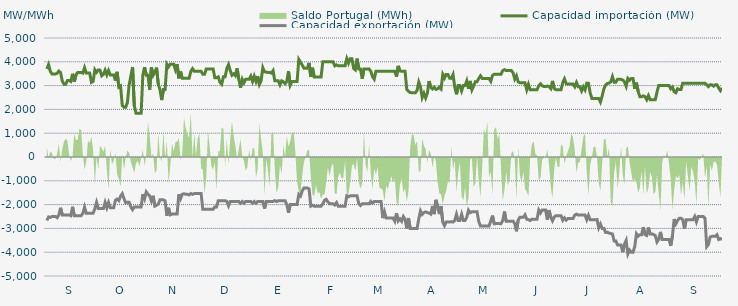
| Category | Capacidad importación (MW) | Capacidad exportación (MW) |
|---|---|---|
| 0 | 3700 | -2666.667 |
| 1900-01-01 | 3883.333 | -2516.667 |
| 1900-01-02 | 3600 | -2537.5 |
| 1900-01-03 | 3487.5 | -2500 |
| 1900-01-04 | 3487.5 | -2500 |
| 1900-01-05 | 3487.5 | -2500 |
| 1900-01-06 | 3518.75 | -2550 |
| 1900-01-07 | 3612.5 | -2433.333 |
| 1900-01-08 | 3543.75 | -2133.333 |
| 1900-01-09 | 3193.75 | -2433.333 |
| 1900-01-10 | 3060.417 | -2433.333 |
| 1900-01-11 | 3059.167 | -2433.333 |
| 1900-01-12 | 3212.5 | -2433.333 |
| 1900-01-13 | 3212.5 | -2433.333 |
| 1900-01-14 | 3175 | -2466.667 |
| 1900-01-15 | 3495.833 | -2091.667 |
| 1900-01-16 | 3166.667 | -2466.667 |
| 1900-01-17 | 3454.167 | -2466.667 |
| 1900-01-18 | 3550 | -2466.667 |
| 1900-01-19 | 3550 | -2466.667 |
| 1900-01-20 | 3550 | -2466.667 |
| 1900-01-21 | 3525 | -2366.667 |
| 1900-01-22 | 3754.167 | -2104.167 |
| 1900-01-23 | 3525 | -2366.667 |
| 1900-01-24 | 3525 | -2366.667 |
| 1900-01-25 | 3525 | -2366.667 |
| 1900-01-26 | 3135 | -2366.667 |
| 1900-01-27 | 3175 | -2366.667 |
| 1900-01-28 | 3666.667 | -2166.667 |
| 1900-01-29 | 3558.333 | -1904.167 |
| 1900-01-30 | 3658.333 | -2166.667 |
| 1900-01-31 | 3650 | -2166.667 |
| 1900-02-01 | 3412.5 | -2166.667 |
| 1900-02-02 | 3475 | -2166.667 |
| 1900-02-03 | 3650 | -1904.167 |
| 1900-02-04 | 3450 | -2133.333 |
| 1900-02-05 | 3633.333 | -1912.5 |
| 1900-02-06 | 3450 | -2133.333 |
| 1900-02-07 | 3450 | -2133.333 |
| 1900-02-08 | 3450 | -2133.333 |
| 1900-02-09 | 3210.417 | -1816.667 |
| 1900-02-10 | 3577.083 | -1766.667 |
| 1900-02-11 | 2937.5 | -1833.333 |
| 1900-02-12 | 2985.417 | -1645.833 |
| 1900-02-13 | 2162.5 | -1541.667 |
| 1900-02-14 | 2087.5 | -1745.833 |
| 1900-02-15 | 2087.5 | -1929.167 |
| 1900-02-16 | 2295.833 | -1900 |
| 1900-02-17 | 3025 | -1900 |
| 1900-02-18 | 3395.833 | -2100 |
| 1900-02-19 | 3781.25 | -2212.5 |
| 1900-02-20 | 2170.833 | -2100 |
| 1900-02-21 | 1837.5 | -2100 |
| 1900-02-22 | 1837.5 | -2100 |
| 1900-02-23 | 1837.5 | -2100 |
| 1900-02-24 | 1837.5 | -2100 |
| 1900-02-25 | 3433.333 | -1566.667 |
| 1900-02-26 | 3776 | -1760 |
| 1900-02-27 | 3433.333 | -1466.667 |
| 1900-02-28 | 3433.333 | -1566.667 |
| 1900-02-28 | 2829.167 | -1633.333 |
| 1900-03-01 | 3766.667 | -1854.167 |
| 1900-03-02 | 3433.333 | -1629.167 |
| 1900-03-03 | 3562.5 | -2066.667 |
| 1900-03-04 | 3754.167 | -2029.167 |
| 1900-03-05 | 3064.583 | -1979.167 |
| 1900-03-06 | 2833.333 | -1800 |
| 1900-03-07 | 2391.667 | -1800 |
| 1900-03-08 | 2833.333 | -1800 |
| 1900-03-09 | 2833.333 | -1841.667 |
| 1900-03-10 | 3900 | -2466.667 |
| 1900-03-11 | 3787.5 | -2133.333 |
| 1900-03-12 | 3900 | -2429.167 |
| 1900-03-13 | 3900 | -2400 |
| 1900-03-14 | 3900 | -2400 |
| 1900-03-15 | 3668.75 | -2400 |
| 1900-03-16 | 3900 | -2400 |
| 1900-03-17 | 3304.167 | -1566.667 |
| 1900-03-18 | 3595.833 | -1754.167 |
| 1900-03-19 | 3304.167 | -1566.667 |
| 1900-03-20 | 3304.167 | -1541.667 |
| 1900-03-21 | 3304.167 | -1566.667 |
| 1900-03-22 | 3304.167 | -1566.667 |
| 1900-03-23 | 3304.167 | -1591.667 |
| 1900-03-24 | 3600 | -1533.333 |
| 1900-03-25 | 3712.5 | -1570.833 |
| 1900-03-26 | 3600 | -1533.333 |
| 1900-03-27 | 3600 | -1533.333 |
| 1900-03-28 | 3600 | -1533.333 |
| 1900-03-29 | 3600 | -1533.333 |
| 1900-03-30 | 3600 | -1533.333 |
| 1900-03-31 | 3475 | -2200 |
| 1900-04-01 | 3475 | -2200 |
| 1900-04-02 | 3700 | -2200 |
| 1900-04-03 | 3700 | -2200 |
| 1900-04-04 | 3700 | -2200 |
| 1900-04-05 | 3700 | -2200 |
| 1900-04-06 | 3700 | -2200 |
| 1900-04-07 | 3329.167 | -2095.833 |
| 1900-04-08 | 3329.167 | -2095.833 |
| 1900-04-09 | 3366.667 | -1833.333 |
| 1900-04-10 | 3141.667 | -1833.333 |
| 1900-04-11 | 3058.333 | -1833.333 |
| 1900-04-12 | 3366.667 | -1833.333 |
| 1900-04-13 | 3366.667 | -1833.333 |
| 1900-04-14 | 3725 | -1866.667 |
| 1900-04-15 | 3883.333 | -2054.167 |
| 1900-04-16 | 3631.25 | -1866.667 |
| 1900-04-17 | 3435.417 | -1866.667 |
| 1900-04-18 | 3495.833 | -1866.667 |
| 1900-04-19 | 3416.667 | -1866.667 |
| 1900-04-20 | 3725 | -1866.667 |
| 1900-04-21 | 3266.667 | -1866.667 |
| 1900-04-22 | 2912.5 | -1941.667 |
| 1900-04-23 | 3266.667 | -1866.667 |
| 1900-04-24 | 3116.667 | -1941.667 |
| 1900-04-25 | 3266.667 | -1866.667 |
| 1900-04-26 | 3266.667 | -1866.667 |
| 1900-04-27 | 3266.667 | -1866.667 |
| 1900-04-28 | 3400 | -1866.667 |
| 1900-04-29 | 3175 | -1941.667 |
| 1900-04-30 | 3400 | -1866.667 |
| 1900-05-01 | 3175 | -1941.667 |
| 1900-05-02 | 3400 | -1866.667 |
| 1900-05-03 | 3047.917 | -1866.667 |
| 1900-05-04 | 3200 | -1866.667 |
| 1900-05-05 | 3754.167 | -1866.667 |
| 1900-05-06 | 3581.25 | -2166.667 |
| 1900-05-07 | 3566.667 | -1866.667 |
| 1900-05-08 | 3554.167 | -1866.667 |
| 1900-05-09 | 3554.167 | -1866.667 |
| 1900-05-10 | 3525 | -1866.667 |
| 1900-05-11 | 3629.167 | -1866.667 |
| 1900-05-12 | 3200 | -1833.333 |
| 1900-05-13 | 3200 | -1870.833 |
| 1900-05-14 | 3200 | -1833.333 |
| 1900-05-15 | 3031.25 | -1833.333 |
| 1900-05-16 | 3200 | -1833.333 |
| 1900-05-17 | 3162.5 | -1833.333 |
| 1900-05-18 | 3083.333 | -1833.333 |
| 1900-05-19 | 3175 | -2000 |
| 1900-05-20 | 3608.333 | -2337.5 |
| 1900-05-21 | 3016.667 | -2000 |
| 1900-05-22 | 3175 | -2000 |
| 1900-05-23 | 3175 | -2000 |
| 1900-05-24 | 3175 | -2000 |
| 1900-05-25 | 3175 | -2000 |
| 1900-05-26 | 4100 | -1566.667 |
| 1900-05-27 | 3987.5 | -1641.667 |
| 1900-05-28 | 3864.583 | -1425 |
| 1900-05-29 | 3733.333 | -1300 |
| 1900-05-30 | 3733.333 | -1300 |
| 1900-05-31 | 3733.333 | -1300 |
| 1900-06-01 | 3952.083 | -1341.667 |
| 1900-06-02 | 3362.5 | -2066.667 |
| 1900-06-03 | 3752.083 | -2029.167 |
| 1900-06-04 | 3362.5 | -2066.667 |
| 1900-06-05 | 3362.5 | -2066.667 |
| 1900-06-06 | 3362.5 | -2066.667 |
| 1900-06-07 | 3362.5 | -2066.667 |
| 1900-06-08 | 3362.5 | -2066.667 |
| 1900-06-09 | 4000 | -1966.667 |
| 1900-06-10 | 4000 | -1816.667 |
| 1900-06-11 | 4000 | -1779.167 |
| 1900-06-12 | 4000 | -1891.667 |
| 1900-06-13 | 4000 | -1966.667 |
| 1900-06-14 | 4000 | -1966.667 |
| 1900-06-15 | 4000 | -1966.667 |
| 1900-06-16 | 3829.167 | -2016.667 |
| 1900-06-17 | 3870.833 | -1916.667 |
| 1900-06-18 | 3829.167 | -2066.667 |
| 1900-06-19 | 3829.167 | -2066.667 |
| 1900-06-20 | 3829.167 | -2066.667 |
| 1900-06-21 | 3829.167 | -2066.667 |
| 1900-06-22 | 3829.167 | -2066.667 |
| 1900-06-23 | 4133.333 | -1633.333 |
| 1900-06-24 | 3945.833 | -1670.833 |
| 1900-06-25 | 4133.333 | -1633.333 |
| 1900-06-26 | 4133.333 | -1633.333 |
| 1900-06-27 | 3716.667 | -1633.333 |
| 1900-06-28 | 3658.333 | -1633.333 |
| 1900-06-29 | 4133.333 | -1633.333 |
| 1900-06-30 | 3700 | -1966.667 |
| 1900-07-01 | 3700 | -2041.667 |
| 1900-07-02 | 3283.333 | -1966.667 |
| 1900-07-03 | 3700 | -1966.667 |
| 1900-07-04 | 3700 | -1966.667 |
| 1900-07-05 | 3700 | -1966.667 |
| 1900-07-06 | 3700 | -1966.667 |
| 1900-07-07 | 3600 | -1866.667 |
| 1900-07-08 | 3375 | -1941.667 |
| 1900-07-09 | 3270.833 | -1866.667 |
| 1900-07-10 | 3600 | -1866.667 |
| 1900-07-11 | 3600 | -1866.667 |
| 1900-07-12 | 3600 | -1866.667 |
| 1900-07-13 | 3600 | -1866.667 |
| 1900-07-14 | 3600 | -2566.667 |
| 1900-07-15 | 3600 | -2304.167 |
| 1900-07-16 | 3600 | -2566.667 |
| 1900-07-17 | 3600 | -2566.667 |
| 1900-07-18 | 3600 | -2566.667 |
| 1900-07-19 | 3600 | -2566.667 |
| 1900-07-20 | 3600 | -2566.667 |
| 1900-07-21 | 3600 | -2700 |
| 1900-07-22 | 3375 | -2362.5 |
| 1900-07-23 | 3829.167 | -2687.5 |
| 1900-07-24 | 3616.667 | -2600 |
| 1900-07-25 | 3600 | -2700 |
| 1900-07-26 | 3600 | -2500 |
| 1900-07-27 | 3600 | -2612.5 |
| 1900-07-28 | 2833.333 | -3000 |
| 1900-07-29 | 2760.87 | -2565.217 |
| 1900-07-30 | 2708.333 | -3000 |
| 1900-07-31 | 2700 | -3000 |
| 1900-08-01 | 2700 | -3000 |
| 1900-08-02 | 2700 | -3000 |
| 1900-08-03 | 2800 | -3000 |
| 1900-08-04 | 3150 | -2600 |
| 1900-08-05 | 2945.833 | -2262.5 |
| 1900-08-06 | 2495.833 | -2412.5 |
| 1900-08-07 | 2675 | -2333.333 |
| 1900-08-08 | 2479.167 | -2308.333 |
| 1900-08-09 | 2675 | -2333.333 |
| 1900-08-10 | 3191.667 | -2358.333 |
| 1900-08-11 | 2933.333 | -2400 |
| 1900-08-12 | 2858.333 | -2062.5 |
| 1900-08-13 | 2933.333 | -2400 |
| 1900-08-14 | 2839.583 | -1800 |
| 1900-08-15 | 2864.583 | -2091.667 |
| 1900-08-16 | 2933.333 | -2400 |
| 1900-08-17 | 2858.333 | -2062.5 |
| 1900-08-18 | 3466.667 | -2733.333 |
| 1900-08-19 | 3316.667 | -2883.333 |
| 1900-08-20 | 3466.667 | -2733.333 |
| 1900-08-21 | 3466.667 | -2733.333 |
| 1900-08-22 | 3310.417 | -2733.333 |
| 1900-08-23 | 3306.25 | -2716.667 |
| 1900-08-24 | 3466.667 | -2733.333 |
| 1900-08-25 | 2933.333 | -2666.667 |
| 1900-08-26 | 2633.333 | -2404.167 |
| 1900-08-27 | 3000 | -2666.667 |
| 1900-08-28 | 3000 | -2666.667 |
| 1900-08-29 | 2775 | -2404.167 |
| 1900-08-30 | 3000 | -2666.667 |
| 1900-08-31 | 3000 | -2666.667 |
| 1900-09-01 | 3200 | -2533.333 |
| 1900-09-02 | 2862.5 | -2233.333 |
| 1900-09-03 | 3195.833 | -2341.667 |
| 1900-09-04 | 2822.917 | -2300 |
| 1900-09-05 | 2983.333 | -2300 |
| 1900-09-06 | 3166.667 | -2300 |
| 1900-09-07 | 3166.667 | -2300 |
| 1900-09-08 | 3300 | -2712.5 |
| 1900-09-09 | 3412.5 | -2900 |
| 1900-09-10 | 3300 | -2900 |
| 1900-09-11 | 3300 | -2900 |
| 1900-09-12 | 3300 | -2900 |
| 1900-09-13 | 3300 | -2900 |
| 1900-09-14 | 3300 | -2900 |
| 1900-09-15 | 3179.167 | -2687.5 |
| 1900-09-16 | 3425 | -2462.5 |
| 1900-09-17 | 3479.167 | -2800 |
| 1900-09-18 | 3479.167 | -2800 |
| 1900-09-19 | 3479.167 | -2791.667 |
| 1900-09-20 | 3479.167 | -2800 |
| 1900-09-21 | 3479.167 | -2800 |
| 1900-09-22 | 3633.333 | -2666.667 |
| 1900-09-23 | 3670.833 | -2291.667 |
| 1900-09-24 | 3633.333 | -2700 |
| 1900-09-25 | 3633.333 | -2700 |
| 1900-09-26 | 3633.333 | -2700 |
| 1900-09-27 | 3633.333 | -2700 |
| 1900-09-28 | 3541.667 | -2695.833 |
| 1900-09-29 | 3275 | -2800 |
| 1900-09-30 | 3412.5 | -3120.833 |
| 1900-10-01 | 3158.333 | -2650 |
| 1900-10-02 | 3116.667 | -2533.333 |
| 1900-10-03 | 3116.667 | -2533.333 |
| 1900-10-04 | 3116.667 | -2533.333 |
| 1900-10-05 | 3116.667 | -2429.167 |
| 1900-10-06 | 2825 | -2612.5 |
| 1900-10-07 | 3054.167 | -2633.333 |
| 1900-10-08 | 2825 | -2668.75 |
| 1900-10-09 | 2825 | -2612.5 |
| 1900-10-10 | 2825 | -2612.5 |
| 1900-10-11 | 2825 | -2612.5 |
| 1900-10-12 | 2825 | -2612.5 |
| 1900-10-13 | 2995.833 | -2229.167 |
| 1900-10-14 | 3075 | -2352.083 |
| 1900-10-15 | 2995.833 | -2229.167 |
| 1900-10-16 | 2958.333 | -2229.167 |
| 1900-10-17 | 2958.333 | -2229.167 |
| 1900-10-18 | 2981.25 | -2641.667 |
| 1900-10-19 | 2958.333 | -2229.167 |
| 1900-10-20 | 2875 | -2533.333 |
| 1900-10-21 | 3195.833 | -2683.333 |
| 1900-10-22 | 2875 | -2525 |
| 1900-10-23 | 2825 | -2466.667 |
| 1900-10-24 | 2825 | -2466.667 |
| 1900-10-25 | 2825 | -2466.667 |
| 1900-10-26 | 2825 | -2466.667 |
| 1900-10-27 | 3129.167 | -2658.333 |
| 1900-10-28 | 3283.333 | -2558.333 |
| 1900-10-29 | 3081.25 | -2654.167 |
| 1900-10-30 | 3062.5 | -2587.5 |
| 1900-10-31 | 3062.5 | -2587.5 |
| 1900-11-01 | 3062.5 | -2587.5 |
| 1900-11-02 | 3062.5 | -2587.5 |
| 1900-11-03 | 2950 | -2441.667 |
| 1900-11-04 | 3133.333 | -2400 |
| 1900-11-05 | 2950 | -2441.667 |
| 1900-11-06 | 2950 | -2441.667 |
| 1900-11-07 | 2775 | -2441.667 |
| 1900-11-08 | 2950 | -2441.667 |
| 1900-11-09 | 2818.75 | -2441.667 |
| 1900-11-10 | 3104.167 | -2637.5 |
| 1900-11-11 | 3100 | -2452.083 |
| 1900-11-12 | 2697.917 | -2637.5 |
| 1900-11-13 | 2462.5 | -2637.5 |
| 1900-11-14 | 2462.5 | -2637.5 |
| 1900-11-15 | 2462.5 | -2637.5 |
| 1900-11-16 | 2462.5 | -2625 |
| 1900-11-17 | 2462.5 | -2975 |
| 1900-11-18 | 2310.417 | -2816.667 |
| 1900-11-19 | 2562.5 | -3000 |
| 1900-11-20 | 2862.5 | -3000 |
| 1900-11-21 | 3025 | -3170.833 |
| 1900-11-22 | 3087.5 | -3158.333 |
| 1900-11-23 | 3106.25 | -3195.833 |
| 1900-11-24 | 3154.167 | -3212.917 |
| 1900-11-25 | 3377.083 | -3233.333 |
| 1900-11-26 | 3145.833 | -3533.333 |
| 1900-11-27 | 3145.833 | -3533.333 |
| 1900-11-28 | 3262.5 | -3700 |
| 1900-11-29 | 3262.5 | -3700 |
| 1900-11-30 | 3262.5 | -3700 |
| 1900-12-01 | 3233.333 | -4000 |
| 1900-12-02 | 3158.333 | -3662.5 |
| 1900-12-03 | 2970.833 | -3504.167 |
| 1900-12-04 | 3300 | -4075 |
| 1900-12-05 | 3225 | -3912.5 |
| 1900-12-06 | 3300 | -4000 |
| 1900-12-07 | 3300 | -4000 |
| 1900-12-08 | 2866.667 | -3766.667 |
| 1900-12-09 | 3125 | -3222.917 |
| 1900-12-10 | 2754.167 | -3325 |
| 1900-12-11 | 2533.333 | -3266.667 |
| 1900-12-12 | 2533.333 | -3266.667 |
| 1900-12-13 | 2570.833 | -2947.917 |
| 1900-12-14 | 2533.333 | -3266.667 |
| 1900-12-15 | 2408.333 | -3300 |
| 1900-12-16 | 2583.333 | -2962.5 |
| 1900-12-17 | 2408.333 | -3237.5 |
| 1900-12-18 | 2408.333 | -3233.333 |
| 1900-12-19 | 2408.333 | -3254.167 |
| 1900-12-20 | 2408.333 | -3300 |
| 1900-12-21 | 2729.167 | -3575 |
| 1900-12-22 | 3000 | -3466.667 |
| 1900-12-23 | 3000 | -3147.917 |
| 1900-12-24 | 3000 | -3466.667 |
| 1900-12-25 | 3000 | -3466.667 |
| 1900-12-26 | 3000 | -3466.667 |
| 1900-12-27 | 3000 | -3466.667 |
| 1900-12-28 | 3000 | -3466.667 |
| 1900-12-29 | 2866.667 | -3733.333 |
| 1900-12-30 | 2941.667 | -3320.833 |
| 1900-12-31 | 2741.667 | -2608.333 |
| 1901-01-01 | 2700 | -2808.333 |
| 1901-01-02 | 2866.667 | -2670.833 |
| 1901-01-03 | 2833.333 | -2575 |
| 1901-01-04 | 2833.333 | -2575 |
| 1901-01-05 | 3100 | -2633.333 |
| 1901-01-06 | 3100 | -3008.333 |
| 1901-01-07 | 3100 | -2633.333 |
| 1901-01-08 | 3100 | -2633.333 |
| 1901-01-09 | 3100 | -2633.333 |
| 1901-01-10 | 3100 | -2633.333 |
| 1901-01-11 | 3100 | -2633.333 |
| 1901-01-12 | 3100 | -2500 |
| 1901-01-13 | 3100 | -2725 |
| 1901-01-14 | 3100 | -2500 |
| 1901-01-15 | 3100 | -2500 |
| 1901-01-16 | 3100 | -2500 |
| 1901-01-17 | 3100 | -2500 |
| 1901-01-18 | 3100 | -2575 |
| 1901-01-19 | 3033.333 | -3766.667 |
| 1901-01-20 | 2958.333 | -3672.917 |
| 1901-01-21 | 3033.333 | -3360.417 |
| 1901-01-22 | 3033.333 | -3333.333 |
| 1901-01-23 | 2976.875 | -3333.333 |
| 1901-01-24 | 3033.333 | -3333.333 |
| 1901-01-25 | 3033.333 | -3266.667 |
| 1901-01-26 | 2900 | -3466.667 |
| 1901-01-27 | 2787.5 | -3429.167 |
| 1901-01-28 | 2900 | -3466.667 |